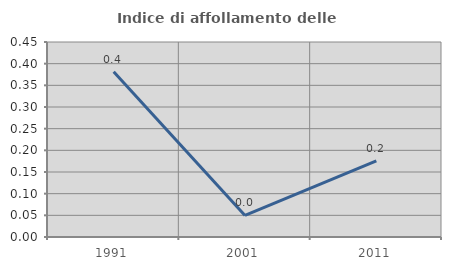
| Category | Indice di affollamento delle abitazioni  |
|---|---|
| 1991.0 | 0.381 |
| 2001.0 | 0.05 |
| 2011.0 | 0.175 |